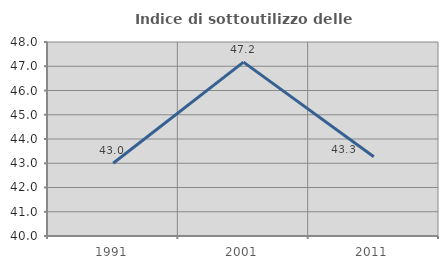
| Category | Indice di sottoutilizzo delle abitazioni  |
|---|---|
| 1991.0 | 43 |
| 2001.0 | 47.17 |
| 2011.0 | 43.269 |